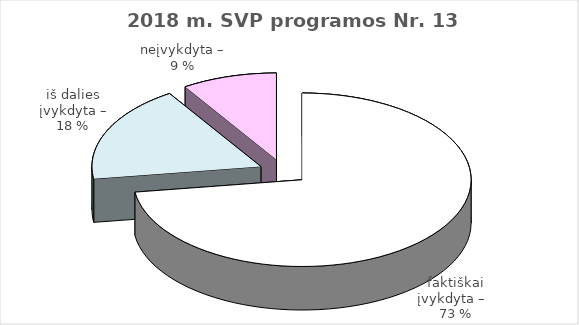
| Category | Series 0 |
|---|---|
| faktiškai įvykdyta –   | 16 |
| iš dalies įvykdyta – | 4 |
| neįvykdyta – | 2 |